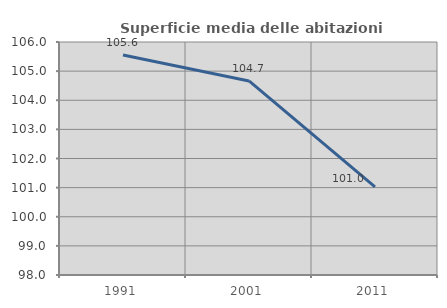
| Category | Superficie media delle abitazioni occupate |
|---|---|
| 1991.0 | 105.551 |
| 2001.0 | 104.662 |
| 2011.0 | 101.027 |